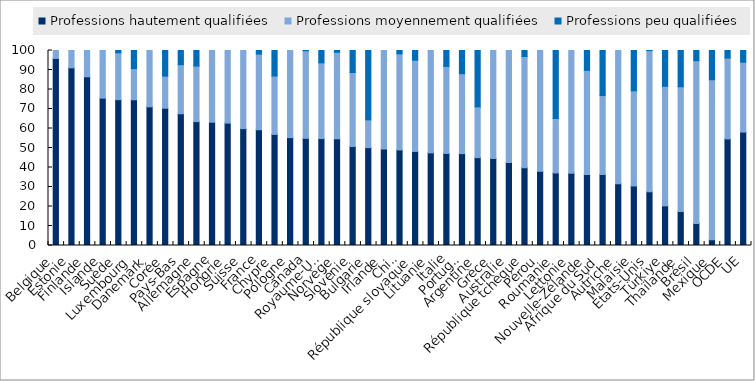
| Category | Professions hautement qualifiées | Professions moyennement qualifiées | Professions peu qualifiées |
|---|---|---|---|
| Belgique | 95.926 | 4.074 | 0 |
| Estonie | 91.111 | 8.889 | 0 |
| Finlande | 86.523 | 13.477 | 0 |
| Islande | 75.567 | 24.433 | 0 |
| Suède | 74.789 | 24.023 | 1.188 |
| Luxembourg | 74.734 | 15.972 | 9.295 |
| Danemark | 71.105 | 28.895 | 0 |
| Corée | 70.405 | 16.451 | 13.144 |
| Pays-Bas | 67.547 | 25.188 | 7.265 |
| Allemagne | 63.511 | 28.494 | 7.995 |
| Espagne | 63.208 | 36.792 | 0 |
| Hongrie | 62.759 | 37.241 | 0 |
| Suisse | 59.931 | 40.069 | 0 |
| France | 59.365 | 38.807 | 1.828 |
| Chypre | 56.961 | 29.948 | 13.091 |
| Pologne | 55.324 | 44.676 | 0 |
| Canada | 54.954 | 44.911 | 0.135 |
| Royaume-Uni | 54.821 | 38.858 | 6.321 |
| Norvège | 54.714 | 44.383 | 0.903 |
| Slovénie | 50.766 | 37.953 | 11.281 |
| Bulgarie | 50.183 | 14.25 | 35.568 |
| Irlande | 49.465 | 50.535 | 0 |
| Chili | 49.014 | 49.255 | 1.731 |
| République slovaque | 48.237 | 46.78 | 4.983 |
| Lituanie | 47.496 | 52.504 | 0 |
| Italie | 47.217 | 44.634 | 8.149 |
| Portugal | 47.113 | 41.006 | 11.881 |
| Argentine | 45.055 | 26.039 | 28.906 |
| Grèce | 44.633 | 55.367 | 0 |
| Australie | 42.572 | 57.428 | 0 |
| République tchèque | 39.877 | 57.066 | 3.057 |
| Pérou | 38.055 | 61.945 | 0 |
| Roumanie | 37.216 | 27.906 | 34.877 |
| Lettonie | 37.056 | 62.944 | 0 |
| Nouvelle-Zélande | 36.405 | 53.422 | 10.172 |
| Afrique du Sud | 36.392 | 40.504 | 23.104 |
| Autriche | 31.627 | 68.373 | 0 |
| Malaisie | 30.524 | 48.786 | 20.689 |
| États-Unis | 27.59 | 72.362 | 0.047 |
| Türkiye | 20.326 | 61.324 | 18.35 |
| Thaïlande | 17.416 | 63.985 | 18.599 |
| Brésil | 11.346 | 83.423 | 5.231 |
| Mexique | 2.903 | 82.111 | 14.986 |
| OCDE | 54.664 | 41.432 | 6.985 |
| UE | 58.15 | 35.832 | 11.574 |